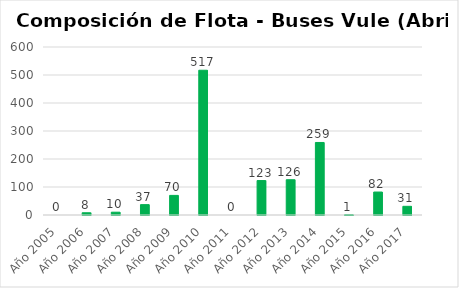
| Category | Series 0 |
|---|---|
| Año 2005 | 0 |
| Año 2006 | 8 |
| Año 2007 | 10 |
| Año 2008 | 37 |
| Año 2009 | 70 |
| Año 2010 | 517 |
| Año 2011 | 0 |
| Año 2012 | 123 |
| Año 2013 | 126 |
| Año 2014 | 259 |
| Año 2015 | 1 |
| Año 2016 | 82 |
| Año 2017 | 31 |